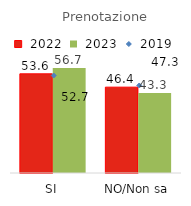
| Category | Series 1 | Series 2 |
|---|---|---|
| SI | 53.6 | 56.7 |
| NO/Non sa | 46.4 | 43.3 |